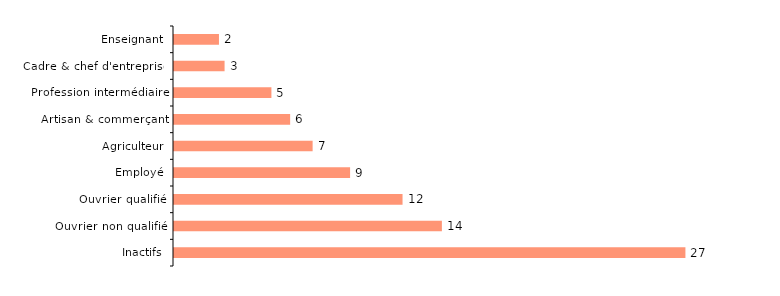
| Category | Series 1 |
|---|---|
| Inactifs | 27.3 |
| Ouvrier non qualifié | 14.3 |
| Ouvrier qualifié | 12.2 |
| Employé | 9.4 |
| Agriculteur | 7.4 |
| Artisan & commerçant | 6.2 |
| Profession intermédiaire | 5.2 |
| Cadre & chef d'entreprise | 2.7 |
| Enseignant | 2.4 |